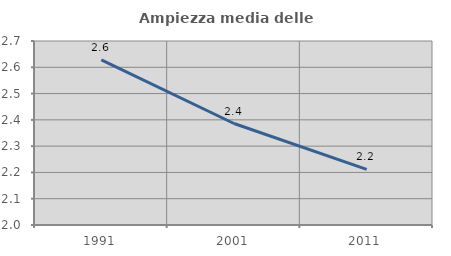
| Category | Ampiezza media delle famiglie |
|---|---|
| 1991.0 | 2.628 |
| 2001.0 | 2.386 |
| 2011.0 | 2.212 |